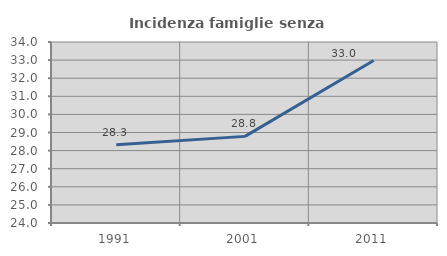
| Category | Incidenza famiglie senza nuclei |
|---|---|
| 1991.0 | 28.322 |
| 2001.0 | 28.786 |
| 2011.0 | 32.977 |